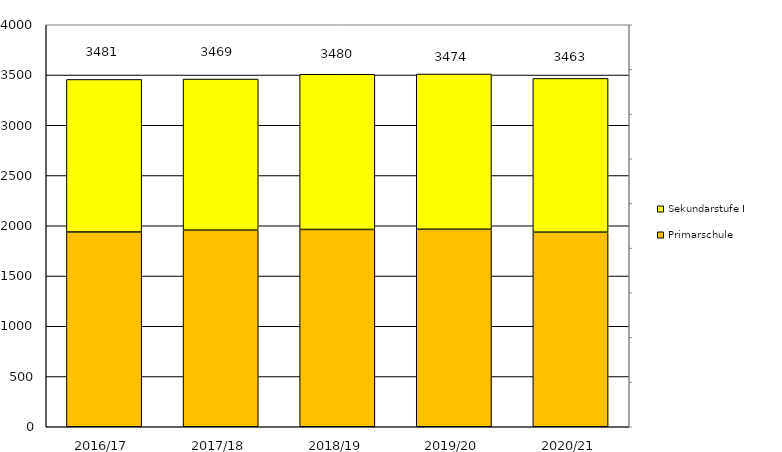
| Category | Primarschule | Sekundarstufe I |
|---|---|---|
| 2016/17 | 1938 | 1518 |
| 2017/18 | 1956 | 1504 |
| 2018/19 | 1963 | 1544 |
| 2019/20 | 1965 | 1545 |
| 2020/21 | 1936 | 1530 |